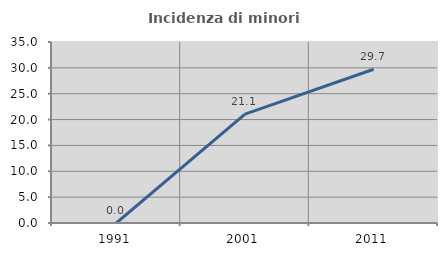
| Category | Incidenza di minori stranieri |
|---|---|
| 1991.0 | 0 |
| 2001.0 | 21.053 |
| 2011.0 | 29.73 |